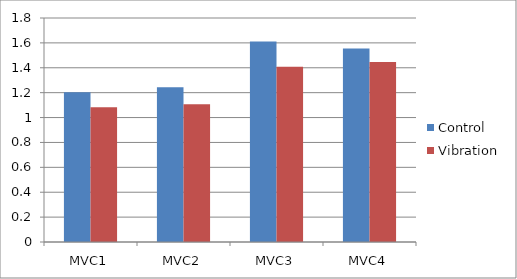
| Category | Control | Vibration |
|---|---|---|
| MVC1 | 1.204 | 1.082 |
| MVC2 | 1.244 | 1.108 |
| MVC3 | 1.611 | 1.408 |
| MVC4 | 1.555 | 1.446 |